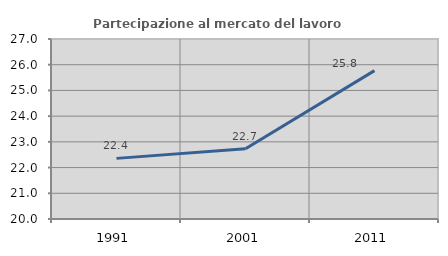
| Category | Partecipazione al mercato del lavoro  femminile |
|---|---|
| 1991.0 | 22.358 |
| 2001.0 | 22.733 |
| 2011.0 | 25.77 |